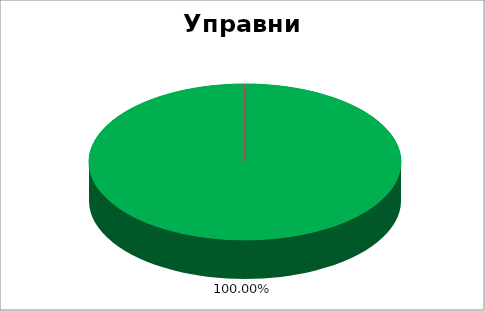
| Category | Управни инспекторат |
|---|---|
| 0 | 1 |
| 1 | 0 |
| 2 | 0 |
| 3 | 0 |
| 4 | 0 |